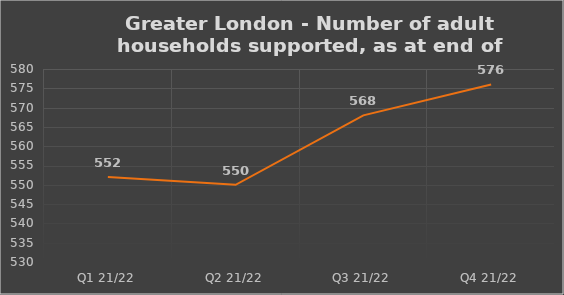
| Category | Number of financially supported households at end of quarter |
|---|---|
| Q1 21/22 | 552 |
| Q2 21/22 | 550 |
| Q3 21/22 | 568 |
| Q4 21/22 | 576 |